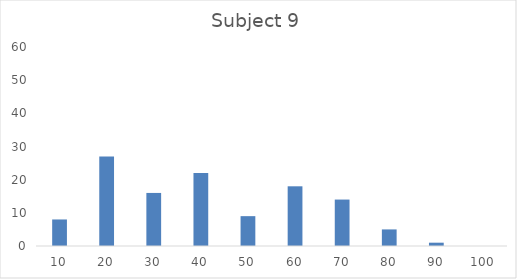
| Category | Frequency |
|---|---|
| 10.0 | 8 |
| 20.0 | 27 |
| 30.0 | 16 |
| 40.0 | 22 |
| 50.0 | 9 |
| 60.0 | 18 |
| 70.0 | 14 |
| 80.0 | 5 |
| 90.0 | 1 |
| 100.0 | 0 |